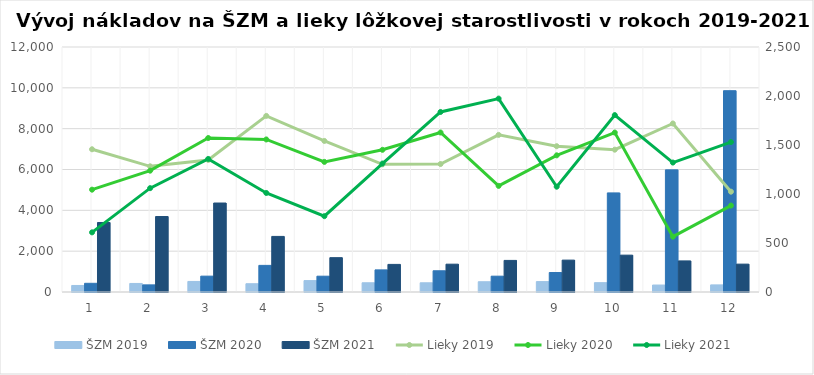
| Category | ŠZM 2019 | ŠZM 2020 | ŠZM 2021 |
|---|---|---|---|
| 0 | 319.7 | 425.62 | 3404.18 |
| 1 | 418.18 | 348.87 | 3696.81 |
| 2 | 517 | 776.44 | 4358.3 |
| 3 | 404.95 | 1303.33 | 2722.82 |
| 4 | 558.65 | 774.47 | 1681.66 |
| 5 | 452.04 | 1082.96 | 1351.77 |
| 6 | 450.86 | 1039.46 | 1362.54 |
| 7 | 502.41 | 775.08 | 1547.34 |
| 8 | 509.2 | 953.63 | 1561.45 |
| 9 | 457.57 | 4854.49 | 1804.75 |
| 10 | 340.97 | 5982.13 | 1522.81 |
| 11 | 347.82 | 9859.75 | 1365.25 |